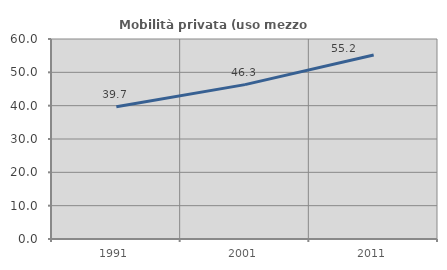
| Category | Mobilità privata (uso mezzo privato) |
|---|---|
| 1991.0 | 39.691 |
| 2001.0 | 46.315 |
| 2011.0 | 55.189 |